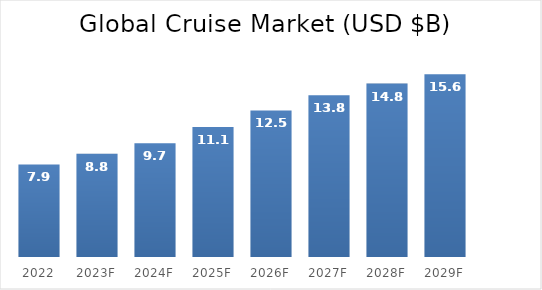
| Category | Series 0 |
|---|---|
| 2022 | 7.9 |
| 2023F | 8.8 |
| 2024F | 9.7 |
| 2025F | 11.1 |
| 2026F | 12.5 |
| 2027F | 13.8 |
| 2028F | 14.8 |
| 2029F | 15.6 |